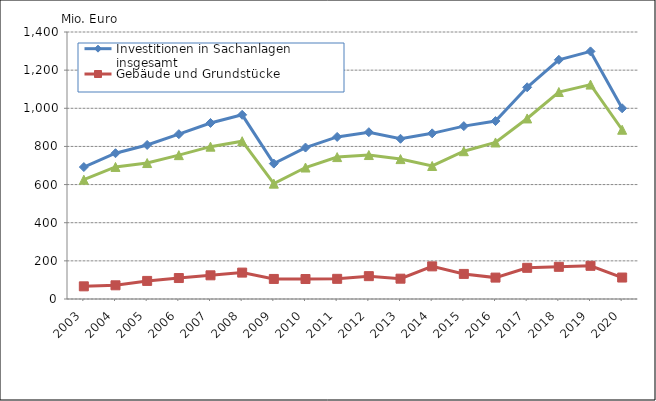
| Category | Investitionen in Sachanlagen insgesamt | Gebäude und Grundstücke | Maschinen und Betriebsausstattung |
|---|---|---|---|
| 2003.0 | 691840 | 66441 | 625399 |
| 2004.0 | 764337 | 71810 | 692527 |
| 2005.0 | 807730 | 94864 | 712866 |
| 2006.0 | 864202 | 109907 | 754295 |
| 2007.0 | 922931 | 124199 | 798732 |
| 2008.0 | 965705 | 138389 | 827316 |
| 2009.0 | 710022 | 105189 | 604833 |
| 2010.0 | 794111 | 104710 | 689400 |
| 2011.0 | 849848.946 | 105760 | 744088.575 |
| 2012.0 | 874647.991 | 119797 | 754850.66 |
| 2013.0 | 840136.552 | 106586 | 733550.844 |
| 2014.0 | 868614.61 | 171128 | 697486.539 |
| 2015.0 | 906511.133 | 131559.378 | 774951.755 |
| 2016.0 | 933005.993 | 112203.211 | 820802.782 |
| 2017.0 | 1110213.856 | 163523.751 | 946690.105 |
| 2018.0 | 1254089.769 | 168719.773 | 1085369.996 |
| 2019.0 | 1298298.969 | 173995.131 | 1124303.838 |
| 2020.0 | 999957.018 | 112502.366 | 887454.652 |